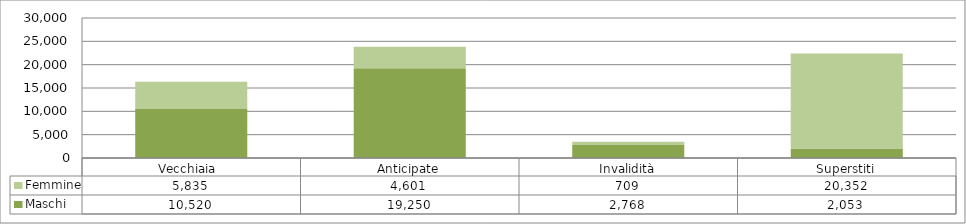
| Category | Maschi | Femmine |
|---|---|---|
| Vecchiaia  | 10520 | 5835 |
| Anticipate | 19250 | 4601 |
| Invalidità | 2768 | 709 |
| Superstiti | 2053 | 20352 |